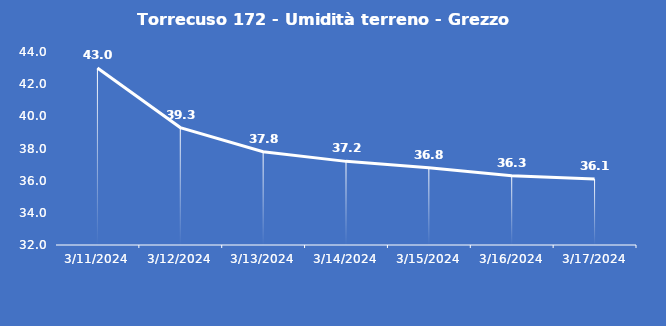
| Category | Torrecuso 172 - Umidità terreno - Grezzo (%VWC) |
|---|---|
| 3/11/24 | 43 |
| 3/12/24 | 39.3 |
| 3/13/24 | 37.8 |
| 3/14/24 | 37.2 |
| 3/15/24 | 36.8 |
| 3/16/24 | 36.3 |
| 3/17/24 | 36.1 |